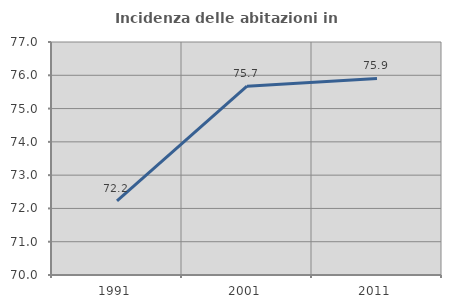
| Category | Incidenza delle abitazioni in proprietà  |
|---|---|
| 1991.0 | 72.23 |
| 2001.0 | 75.672 |
| 2011.0 | 75.904 |